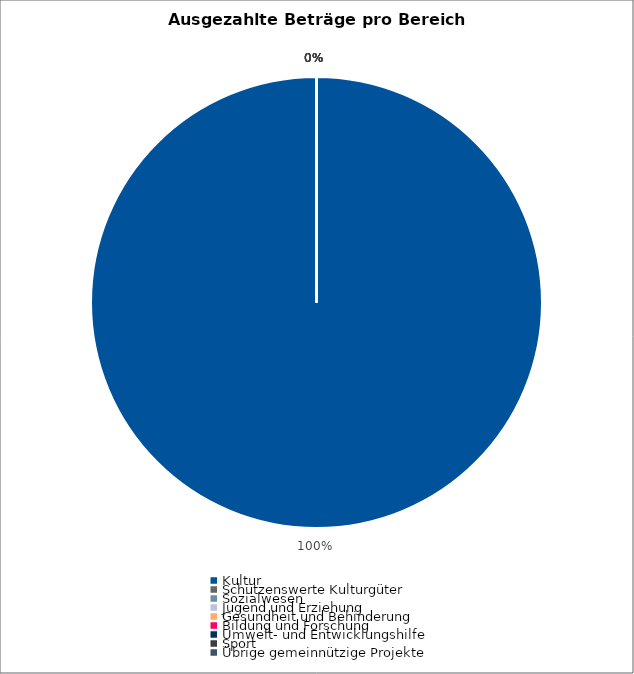
| Category | Series 0 |
|---|---|
| Kultur | 1656793 |
| Schützenswerte Kulturgüter | 0 |
| Sozialwesen | 0 |
| Jugend und Erziehung | 0 |
| Gesundheit und Behinderung | 0 |
| Bildung und Forschung | 0 |
| Umwelt- und Entwicklungshilfe | 0 |
| Sport | 0 |
| Übrige gemeinnützige Projekte | 0 |